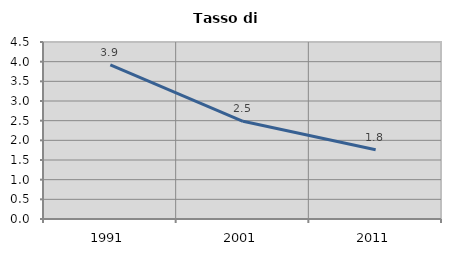
| Category | Tasso di disoccupazione   |
|---|---|
| 1991.0 | 3.918 |
| 2001.0 | 2.484 |
| 2011.0 | 1.759 |